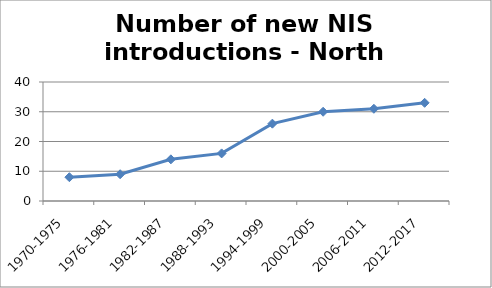
| Category | Number of new NIS introductions - North Sea |
|---|---|
| 1970-1975 | 8 |
| 1976-1981 | 9 |
| 1982-1987 | 14 |
| 1988-1993 | 16 |
| 1994-1999 | 26 |
| 2000-2005 | 30 |
| 2006-2011 | 31 |
| 2012-2017 | 33 |